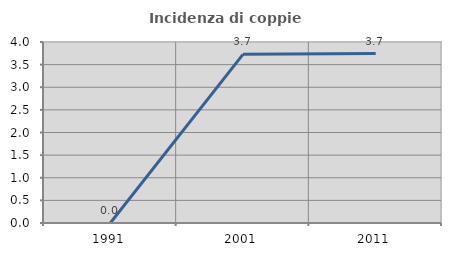
| Category | Incidenza di coppie miste |
|---|---|
| 1991.0 | 0 |
| 2001.0 | 3.727 |
| 2011.0 | 3.743 |